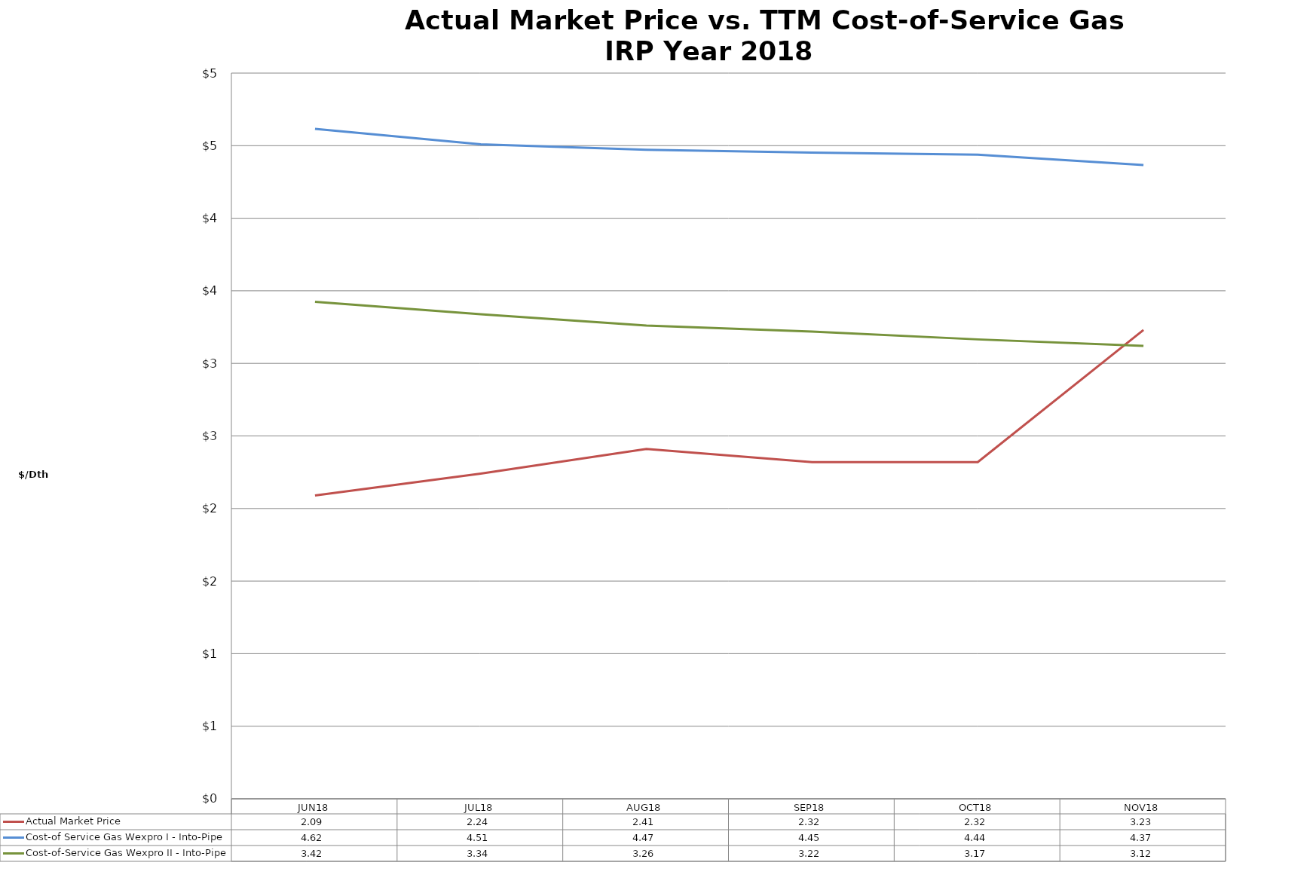
| Category | Actual Market Price | Cost-of Service Gas Wexpro I - Into-Pipe | Cost-of-Service Gas Wexpro II - Into-Pipe |
|---|---|---|---|
| JUN18 | 2.09 | 4.616 | 3.425 |
| JUL18 | 2.24 | 4.509 | 3.338 |
| AUG18 | 2.41 | 4.472 | 3.261 |
| SEP18 | 2.32 | 4.453 | 3.219 |
| OCT18 | 2.32 | 4.437 | 3.165 |
| NOV18 | 3.23 | 4.367 | 3.121 |